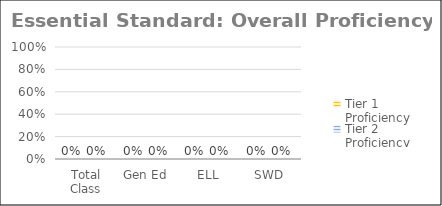
| Category | Tier 1 Proficiency | Tier 2 Proficiency |
|---|---|---|
| Total Class | 0 | 0 |
| Gen Ed | 0 | 0 |
| ELL | 0 | 0 |
| SWD | 0 | 0 |